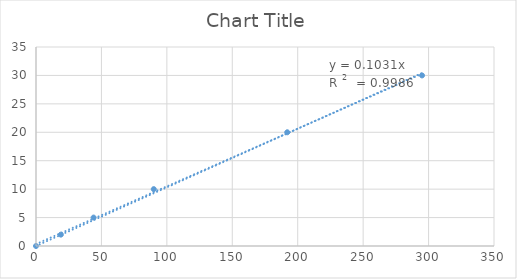
| Category | Series 0 |
|---|---|
| 0.0 | 0 |
| 19.0 | 2 |
| 44.0 | 5 |
| 90.0 | 10 |
| 192.0 | 20 |
| 295.0 | 30 |